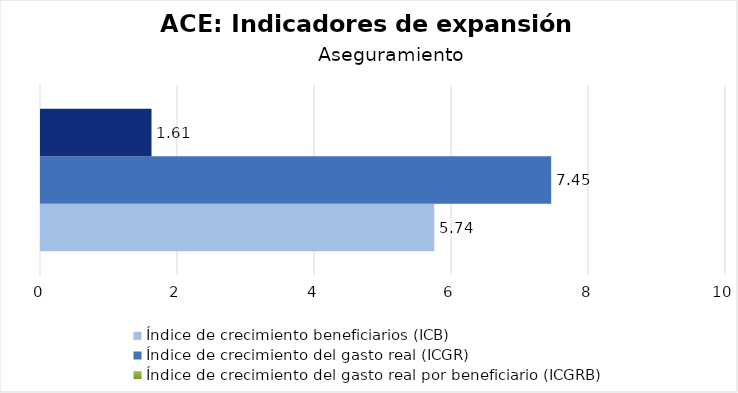
| Category | Índice de crecimiento beneficiarios (ICB)  | Índice de crecimiento del gasto real (ICGR)  | Índice de crecimiento del gasto real por beneficiario (ICGRB)  |
|---|---|---|---|
| Aseguramiento | 5.742 | 7.448 | 1.613 |